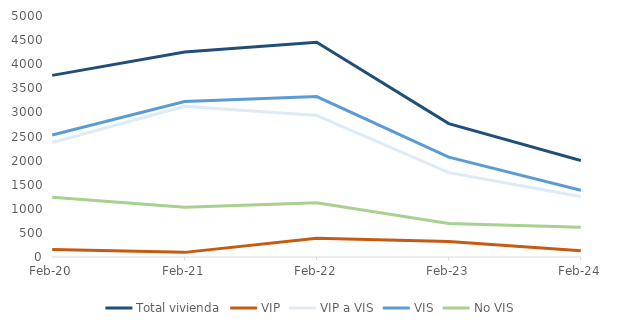
| Category | Total vivienda | VIP | VIP a VIS | VIS | No VIS |
|---|---|---|---|---|---|
| 2020-02-01 | 3768 | 157 | 2373 | 2530 | 1238 |
| 2021-02-01 | 4255 | 96 | 3129 | 3225 | 1030 |
| 2022-02-01 | 4454 | 390 | 2938 | 3328 | 1126 |
| 2023-02-01 | 2768 | 322 | 1751 | 2073 | 695 |
| 2024-02-01 | 2002 | 131 | 1253 | 1384 | 618 |